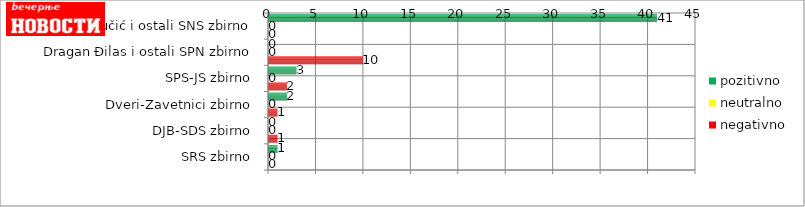
| Category | pozitivno | neutralno | negativno |
|---|---|---|---|
| Aleksandar Vučić i ostali SNS zbirno | 41 | 0 | 0 |
| Dragan Đilas i ostali SPN zbirno | 0 | 0 | 10 |
| SPS-JS zbirno | 3 | 0 | 2 |
| Dveri-Zavetnici zbirno | 2 | 0 | 1 |
| DJB-SDS zbirno | 0 | 0 | 1 |
| SRS zbirno | 1 | 0 | 0 |